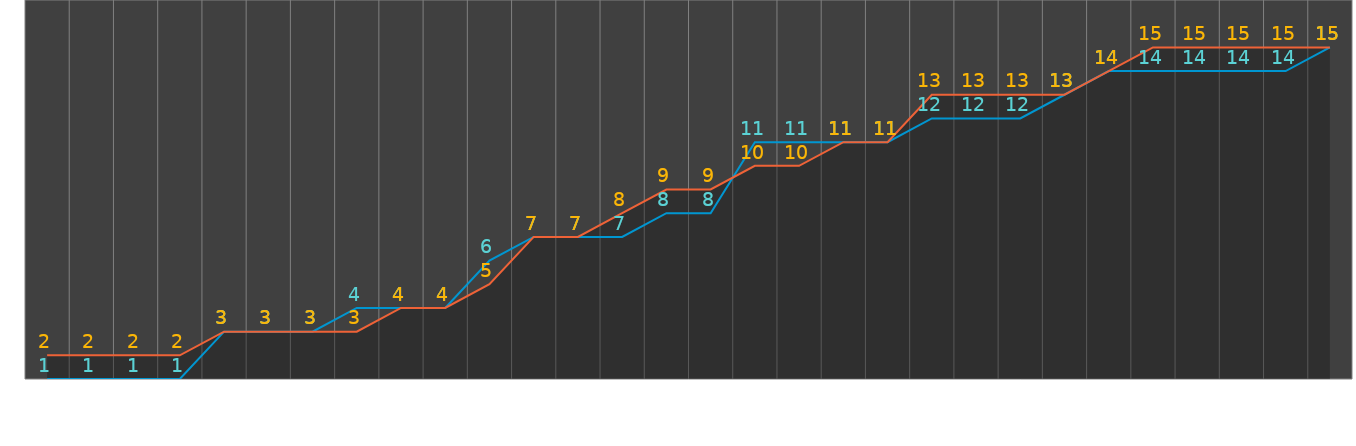
| Category | Opened | Closed | Opened Lables | Closed Labels |
|---|---|---|---|---|
| 5/1/13 | 0 | 1 | 0.56 | 1.56 |
| 5/2/13 | 0 | 1 | 0.56 | 1.56 |
| 5/3/13 | 0 | 1 | 0.56 | 1.56 |
| 5/4/13 | 0 | 1 | 0.56 | 1.56 |
| 5/5/13 | 2 | 2 | 2.56 | 2.56 |
| 5/6/13 | 2 | 2 | 2.56 | 2.56 |
| 5/7/13 | 2 | 2 | 2.56 | 2.56 |
| 5/8/13 | 3 | 2 | 3.56 | 2.56 |
| 5/9/13 | 3 | 3 | 3.56 | 3.56 |
| 5/10/13 | 3 | 3 | 3.56 | 3.56 |
| 5/11/13 | 5 | 4 | 5.56 | 4.56 |
| 5/12/13 | 6 | 6 | 6.56 | 6.56 |
| 5/13/13 | 6 | 6 | 6.56 | 6.56 |
| 5/14/13 | 6 | 7 | 6.56 | 7.56 |
| 5/15/13 | 7 | 8 | 7.56 | 8.56 |
| 5/16/13 | 7 | 8 | 7.56 | 8.56 |
| 5/17/13 | 10 | 9 | 10.56 | 9.56 |
| 5/18/13 | 10 | 9 | 10.56 | 9.56 |
| 5/19/13 | 10 | 10 | 10.56 | 10.56 |
| 5/20/13 | 10 | 10 | 10.56 | 10.56 |
| 5/21/13 | 11 | 12 | 11.56 | 12.56 |
| 5/22/13 | 11 | 12 | 11.56 | 12.56 |
| 5/23/13 | 11 | 12 | 11.56 | 12.56 |
| 5/24/13 | 12 | 12 | 12.56 | 12.56 |
| 5/25/13 | 13 | 13 | 13.56 | 13.56 |
| 5/26/13 | 13 | 14 | 13.56 | 14.56 |
| 5/27/13 | 13 | 14 | 13.56 | 14.56 |
| 5/28/13 | 13 | 14 | 13.56 | 14.56 |
| 5/29/13 | 13 | 14 | 13.56 | 14.56 |
| 5/30/13 | 14 | 14 | 14.56 | 14.56 |